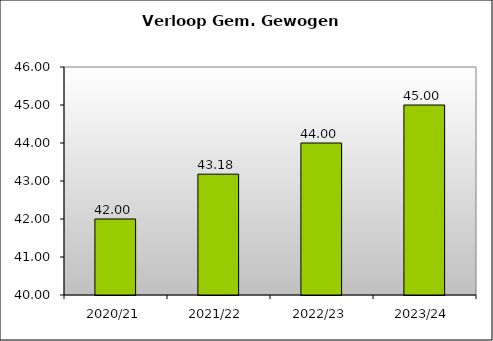
| Category | GGL |
|---|---|
| 2020/21 | 42 |
| 2021/22 | 43.18 |
| 2022/23 | 44 |
| 2023/24 | 45 |